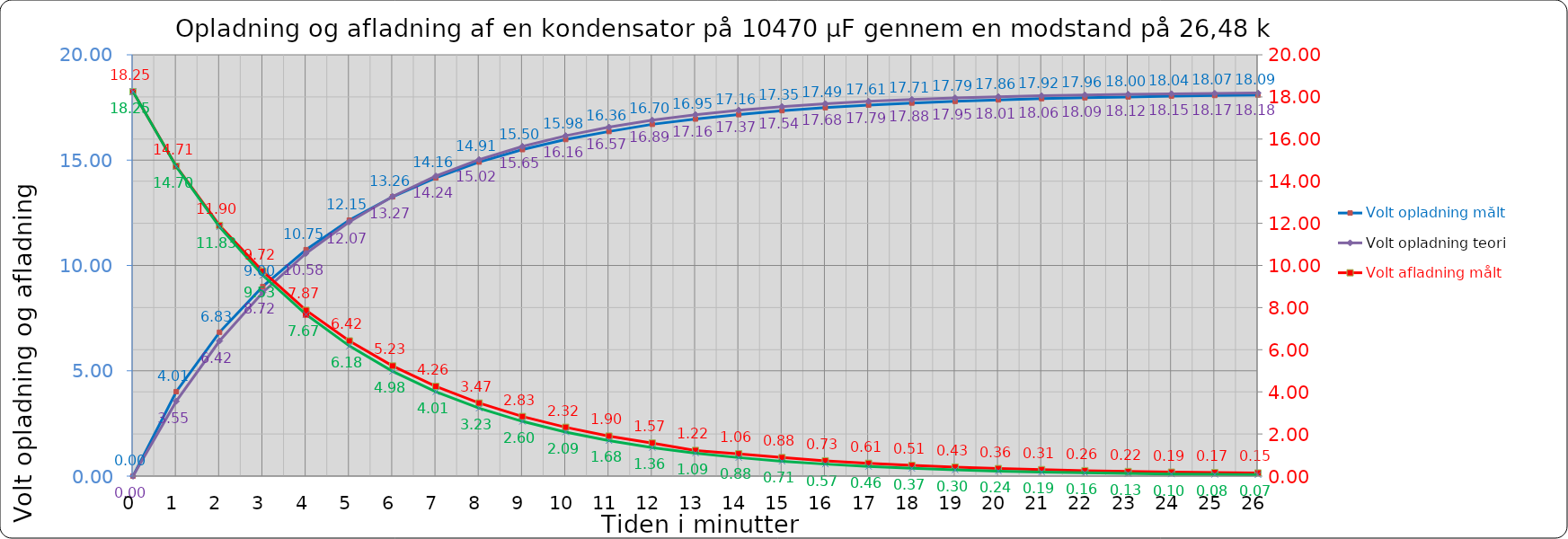
| Category | Volt opladning målt |
|---|---|
| 0.0 | 0 |
| 1.0 | 4.01 |
| 2.0 | 6.83 |
| 3.0 | 9 |
| 4.0 | 10.75 |
| 5.0 | 12.15 |
| 6.0 | 13.26 |
| 7.0 | 14.16 |
| 8.0 | 14.91 |
| 9.0 | 15.5 |
| 10.0 | 15.98 |
| 11.0 | 16.36 |
| 12.0 | 16.7 |
| 13.0 | 16.95 |
| 14.0 | 17.16 |
| 15.0 | 17.35 |
| 16.0 | 17.49 |
| 17.0 | 17.61 |
| 18.0 | 17.71 |
| 19.0 | 17.79 |
| 20.0 | 17.86 |
| 21.0 | 17.92 |
| 22.0 | 17.96 |
| 23.0 | 18 |
| 24.0 | 18.04 |
| 25.0 | 18.07 |
| 26.0 | 18.09 |